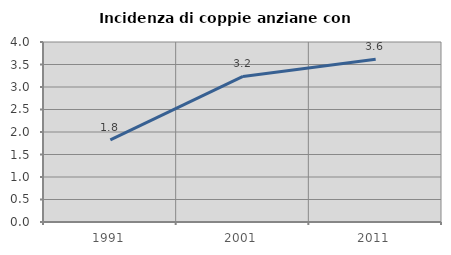
| Category | Incidenza di coppie anziane con figli |
|---|---|
| 1991.0 | 1.823 |
| 2001.0 | 3.235 |
| 2011.0 | 3.614 |